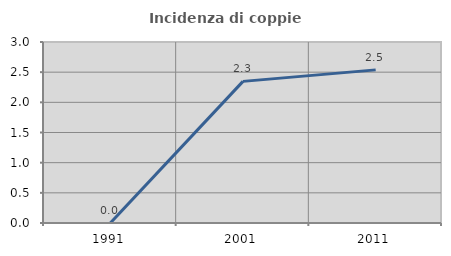
| Category | Incidenza di coppie miste |
|---|---|
| 1991.0 | 0 |
| 2001.0 | 2.347 |
| 2011.0 | 2.538 |